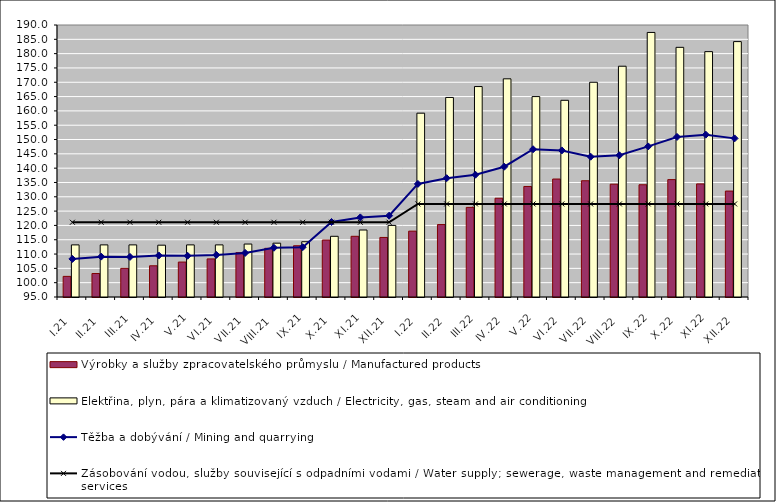
| Category | Výrobky a služby zpracovatelského průmyslu / Manufactured products | Elektřina, plyn, pára a klimatizovaný vzduch / Electricity, gas, steam and air conditioning |
|---|---|---|
| I.21 | 102.2 | 113.2 |
| II.21 | 103.2 | 113.2 |
| III.21 | 105 | 113.2 |
| IV.21 | 105.9 | 113.1 |
| V.21 | 107.2 | 113.2 |
| VI.21 | 108.3 | 113.2 |
| VII.21 | 110.5 | 113.5 |
| VIII.21 | 112 | 113.8 |
| IX.21 | 112.9 | 114.3 |
| X.21 | 114.9 | 116.2 |
| XI.21 | 116.2 | 118.4 |
| XII.21 | 115.8 | 120 |
| I.22 | 118 | 159.2 |
| II.22 | 120.3 | 164.7 |
| III.22 | 126.3 | 168.5 |
| IV.22 | 129.5 | 171.2 |
| V.22 | 133.6 | 165 |
| VI.22 | 136.2 | 163.7 |
| VII.22 | 135.6 | 170 |
| VIII.22 | 134.4 | 175.6 |
| IX.22 | 134.2 | 187.4 |
| X.22 | 136 | 182.2 |
| XI.22 | 134.5 | 180.7 |
| XII.22 | 132 | 184.2 |